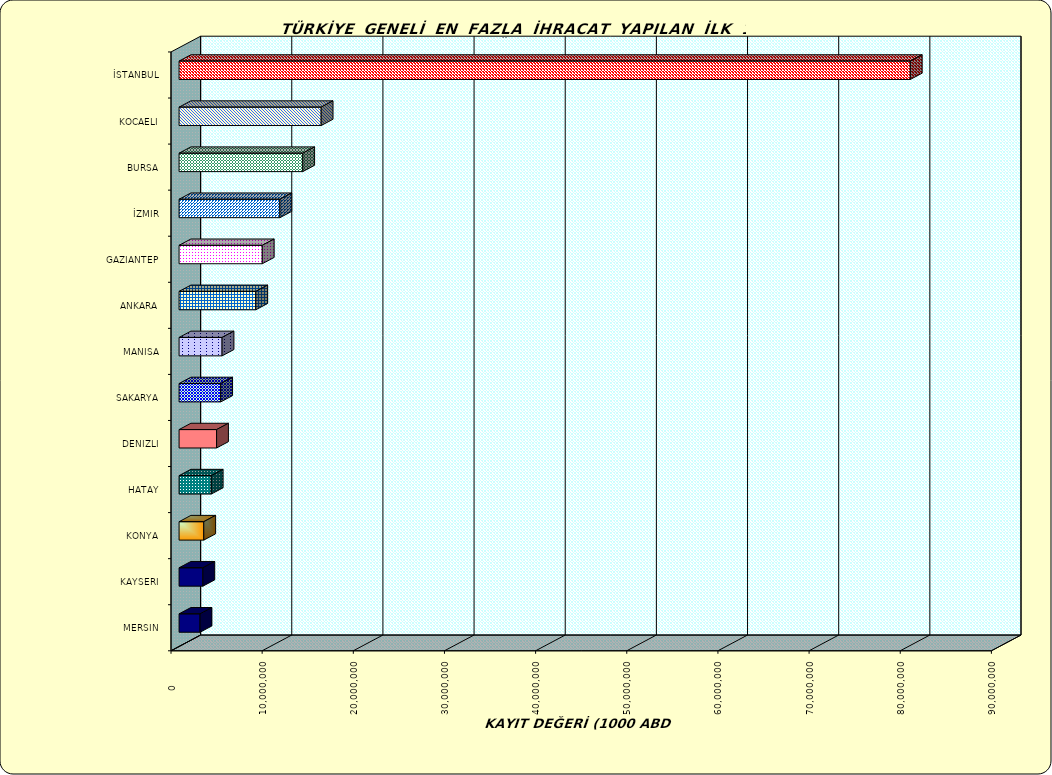
| Category | Series 0 |
|---|---|
| İSTANBUL | 80218105.102 |
| KOCAELI | 15588833.44 |
| BURSA | 13566970.735 |
| İZMIR | 11059308.623 |
| GAZIANTEP | 9128060.298 |
| ANKARA | 8416870.79 |
| MANISA | 4716000.547 |
| SAKARYA | 4565171.988 |
| DENIZLI | 4113898.993 |
| HATAY | 3531825.854 |
| KONYA | 2710000.844 |
| KAYSERI | 2609878.542 |
| MERSIN | 2299902.982 |